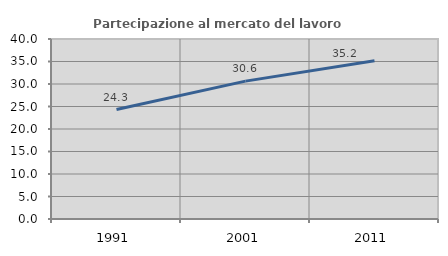
| Category | Partecipazione al mercato del lavoro  femminile |
|---|---|
| 1991.0 | 24.32 |
| 2001.0 | 30.635 |
| 2011.0 | 35.15 |